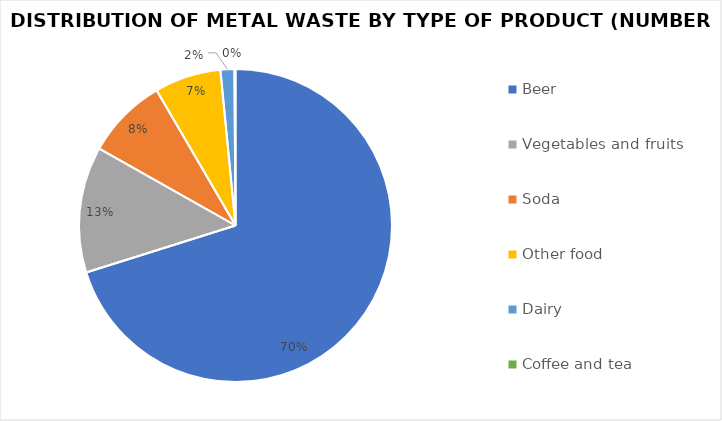
| Category | Series 0 |
|---|---|
| Beer | 1318 |
| Vegetables and fruits | 245 |
| Soda | 158 |
| Other food | 129 |
| Dairy | 27 |
| Coffee and tea | 2 |